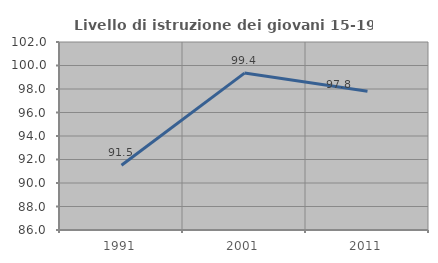
| Category | Livello di istruzione dei giovani 15-19 anni |
|---|---|
| 1991.0 | 91.515 |
| 2001.0 | 99.355 |
| 2011.0 | 97.81 |